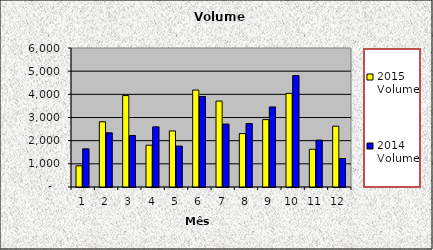
| Category | 2015 Volume | 2014 Volume |
|---|---|---|
| 0 | 912.333 | 1646.167 |
| 1 | 2816.333 | 2340.333 |
| 2 | 3946.833 | 2221.333 |
| 3 | 1804.833 | 2598.167 |
| 4 | 2419.667 | 1765.167 |
| 5 | 4184.833 | 3907.167 |
| 6 | 3709 | 2717 |
| 7 | 2307.648 | 2737 |
| 8 | 2909 | 3454 |
| 9 | 4042.26 | 4808 |
| 10 | 1629 | 2023 |
| 11 | 2625 | 1229.667 |